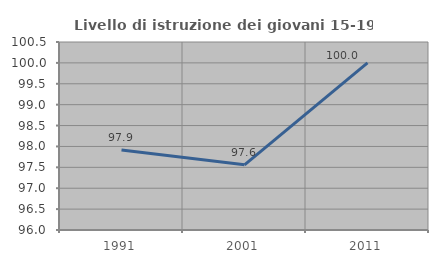
| Category | Livello di istruzione dei giovani 15-19 anni |
|---|---|
| 1991.0 | 97.917 |
| 2001.0 | 97.561 |
| 2011.0 | 100 |